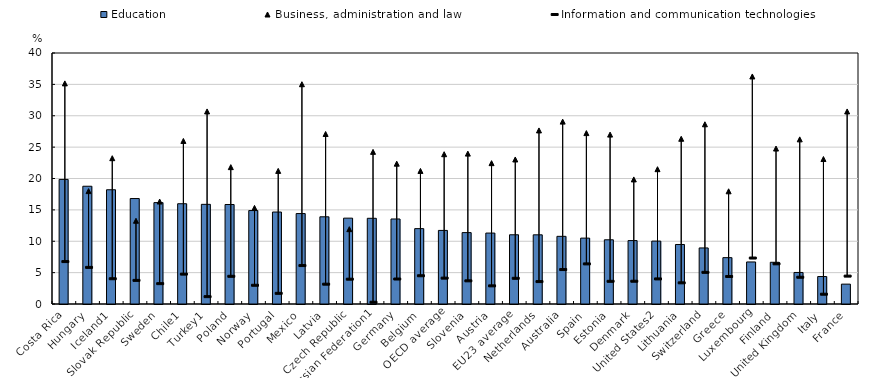
| Category | Education |
|---|---|
| Costa Rica | 19.853 |
| Hungary | 18.767 |
| Iceland1 | 18.205 |
| Slovak Republic | 16.807 |
| Sweden | 16.157 |
| Chile1 | 15.98 |
| Turkey1 | 15.883 |
| Poland | 15.856 |
| Norway | 14.893 |
| Portugal | 14.658 |
| Mexico | 14.411 |
| Latvia | 13.895 |
| Czech Republic | 13.682 |
| Russian Federation1 | 13.659 |
| Germany | 13.551 |
| Belgium | 12.009 |
| OECD average | 11.727 |
| Slovenia | 11.379 |
| Austria | 11.303 |
| EU23 average | 11.032 |
| Netherlands | 11.025 |
| Australia | 10.782 |
| Spain | 10.498 |
| Estonia | 10.233 |
| Denmark | 10.105 |
| United States2 | 10.024 |
| Lithuania | 9.484 |
| Switzerland | 8.933 |
| Greece | 7.386 |
| Luxembourg | 6.7 |
| Finland | 6.65 |
| United Kingdom | 5.026 |
| Italy | 4.377 |
| France | 3.167 |